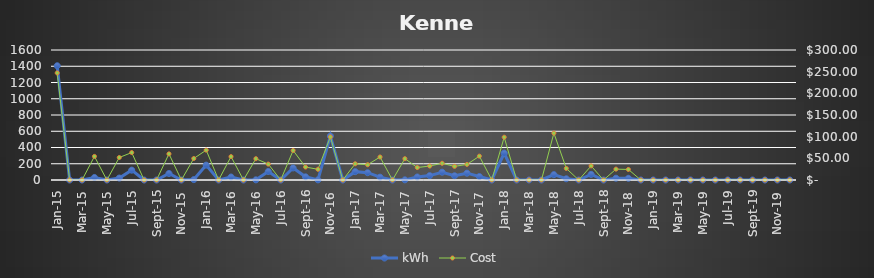
| Category | kWh |
|---|---|
| 2015-01-01 | 1406 |
| 2015-02-01 | 0 |
| 2015-03-01 | 0 |
| 2015-04-01 | 31 |
| 2015-05-01 | 0 |
| 2015-06-01 | 24 |
| 2015-07-01 | 121 |
| 2015-08-01 | 0 |
| 2015-09-01 | 0 |
| 2015-10-01 | 80 |
| 2015-11-01 | 0 |
| 2015-12-01 | 5 |
| 2016-01-01 | 183 |
| 2016-02-01 | 0 |
| 2016-03-01 | 37 |
| 2016-04-01 | 0 |
| 2016-05-01 | 2 |
| 2016-06-01 | 105 |
| 2016-07-01 | 0 |
| 2016-08-01 | 148 |
| 2016-09-01 | 39 |
| 2016-10-01 | 2 |
| 2016-11-01 | 541 |
| 2016-12-01 | 0 |
| 2017-01-01 | 103 |
| 2017-02-01 | 90 |
| 2017-03-01 | 35 |
| 2017-04-01 | 0 |
| 2017-05-01 | 2 |
| 2017-06-01 | 37 |
| 2017-07-01 | 54 |
| 2017-08-01 | 96 |
| 2017-09-01 | 52 |
| 2017-10-01 | 84 |
| 2017-11-01 | 43 |
| 2017-12-01 | 0 |
| 2018-01-01 | 330 |
| 2018-02-01 | 0 |
| 2018-03-01 | 0 |
| 2018-04-01 | 0 |
| 2018-05-01 | 66 |
| 2018-06-01 | 15 |
| 2018-07-01 | 0 |
| 2018-08-01 | 69 |
| 2018-09-01 | 0 |
| 2018-10-01 | 22 |
| 2018-11-01 | 21 |
| 2018-12-01 | 0 |
| 2019-01-01 | 0 |
| 2019-02-01 | 0 |
| 2019-03-01 | 0 |
| 2019-04-01 | 0 |
| 2019-05-01 | 0 |
| 2019-06-01 | 0 |
| 2019-07-01 | 0 |
| 2019-08-01 | 0 |
| 2019-09-01 | 0 |
| 2019-10-01 | 0 |
| 2019-11-01 | 0 |
| 2019-12-01 | 0 |